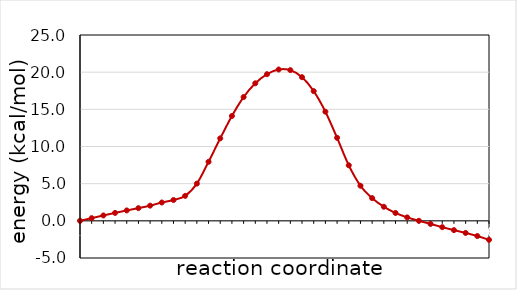
| Category | Series 0 |
|---|---|
| 1.0 | 0 |
| 2.0 | 0.362 |
| 3.0 | 0.725 |
| 4.0 | 1.066 |
| 5.0 | 1.399 |
| 6.0 | 1.707 |
| 7.0 | 2.042 |
| 8.0 | 2.465 |
| 9.0 | 2.8 |
| 10.0 | 3.361 |
| 11.0 | 5.006 |
| 12.0 | 7.942 |
| 13.0 | 11.095 |
| 14.0 | 14.106 |
| 15.0 | 16.651 |
| 16.0 | 18.501 |
| 17.0 | 19.726 |
| 18.0 | 20.358 |
| 19.0 | 20.27 |
| 20.0 | 19.324 |
| 21.0 | 17.451 |
| 22.0 | 14.681 |
| 23.0 | 11.166 |
| 24.0 | 7.472 |
| 25.0 | 4.721 |
| 26.0 | 3.055 |
| 27.0 | 1.894 |
| 28.0 | 1.06 |
| 29.0 | 0.462 |
| 30.0 | 0.006 |
| 31.0 | -0.416 |
| 32.0 | -0.853 |
| 33.0 | -1.251 |
| 34.0 | -1.629 |
| 35.0 | -2.045 |
| 36.0 | -2.558 |